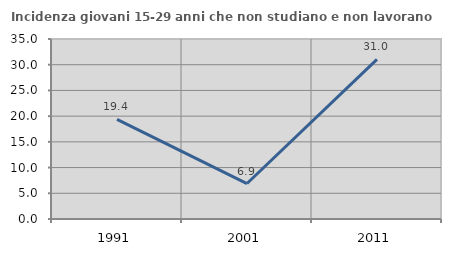
| Category | Incidenza giovani 15-29 anni che non studiano e non lavorano  |
|---|---|
| 1991.0 | 19.355 |
| 2001.0 | 6.897 |
| 2011.0 | 31.034 |